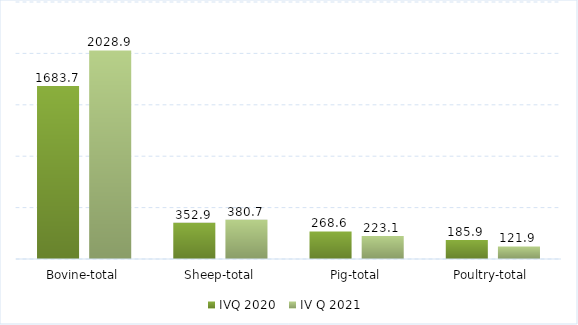
| Category | IVQ 2020 | IV Q 2021 |
|---|---|---|
| Bovine-total | 1683.694 | 2028.923 |
| Sheep-total | 352.9 | 380.7 |
| Pig-total | 268.6 | 223.051 |
| Poultry-total | 185.9 | 121.9 |